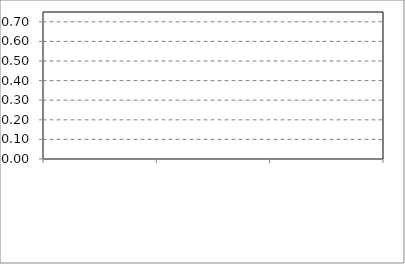
| Category | Chart Adjustment |
|---|---|
| 0 | 0 |
| 1 | 0 |
| 2 | 0 |